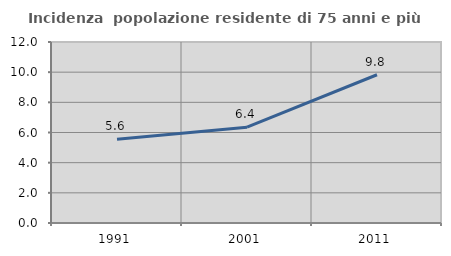
| Category | Incidenza  popolazione residente di 75 anni e più |
|---|---|
| 1991.0 | 5.558 |
| 2001.0 | 6.35 |
| 2011.0 | 9.829 |